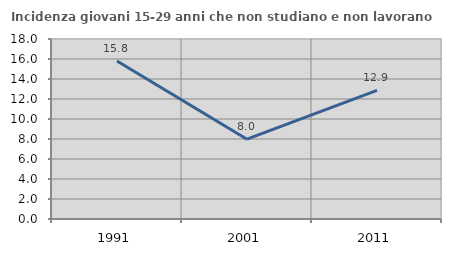
| Category | Incidenza giovani 15-29 anni che non studiano e non lavorano  |
|---|---|
| 1991.0 | 15.809 |
| 2001.0 | 7.981 |
| 2011.0 | 12.871 |